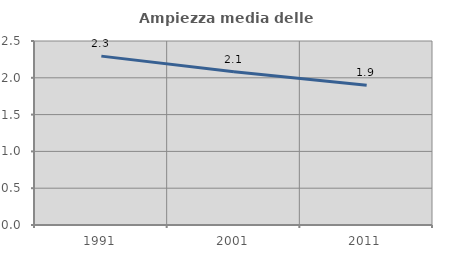
| Category | Ampiezza media delle famiglie |
|---|---|
| 1991.0 | 2.295 |
| 2001.0 | 2.083 |
| 2011.0 | 1.9 |